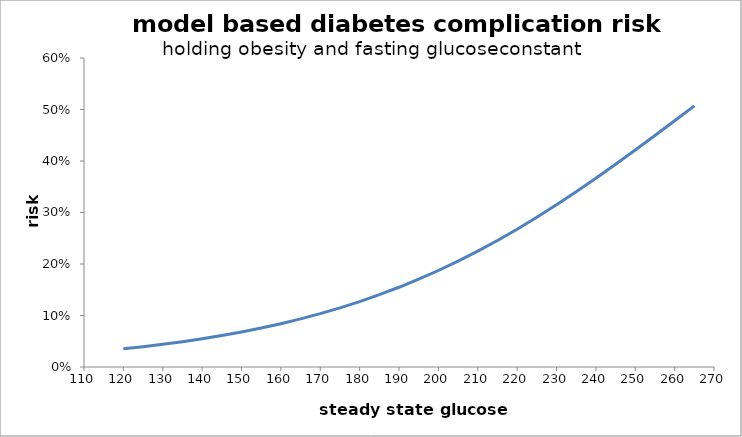
| Category | risk |
|---|---|
| 120.0 | 0.035 |
| 125.0 | 0.039 |
| 130.0 | 0.044 |
| 135.0 | 0.049 |
| 140.0 | 0.055 |
| 145.0 | 0.061 |
| 150.0 | 0.068 |
| 155.0 | 0.076 |
| 160.0 | 0.084 |
| 165.0 | 0.093 |
| 170.0 | 0.104 |
| 175.0 | 0.115 |
| 180.0 | 0.127 |
| 185.0 | 0.14 |
| 190.0 | 0.155 |
| 195.0 | 0.17 |
| 200.0 | 0.187 |
| 205.0 | 0.206 |
| 210.0 | 0.225 |
| 215.0 | 0.246 |
| 220.0 | 0.268 |
| 225.0 | 0.291 |
| 230.0 | 0.315 |
| 235.0 | 0.34 |
| 240.0 | 0.367 |
| 245.0 | 0.394 |
| 250.0 | 0.421 |
| 255.0 | 0.45 |
| 260.0 | 0.478 |
| 265.0 | 0.507 |